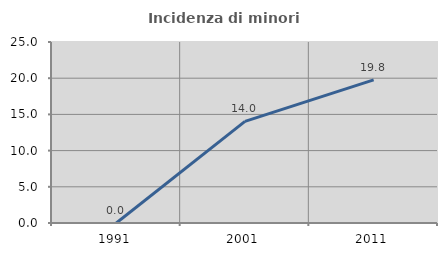
| Category | Incidenza di minori stranieri |
|---|---|
| 1991.0 | 0 |
| 2001.0 | 14.035 |
| 2011.0 | 19.76 |